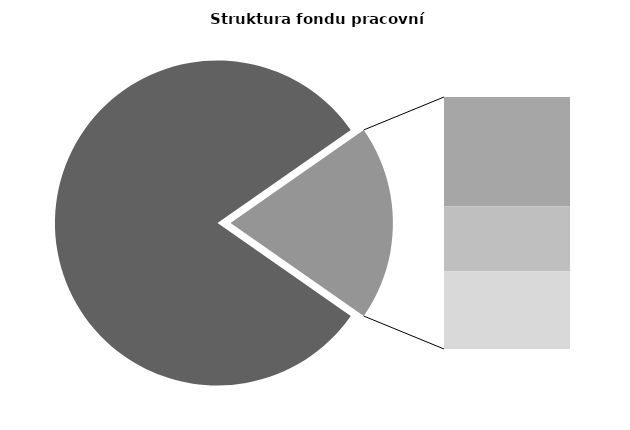
| Category | Series 0 |
|---|---|
| Průměrná měsíční odpracovaná doba bez přesčasu | 138.111 |
| Dovolená | 14.464 |
| Nemoc | 8.551 |
| Jiné | 10.238 |